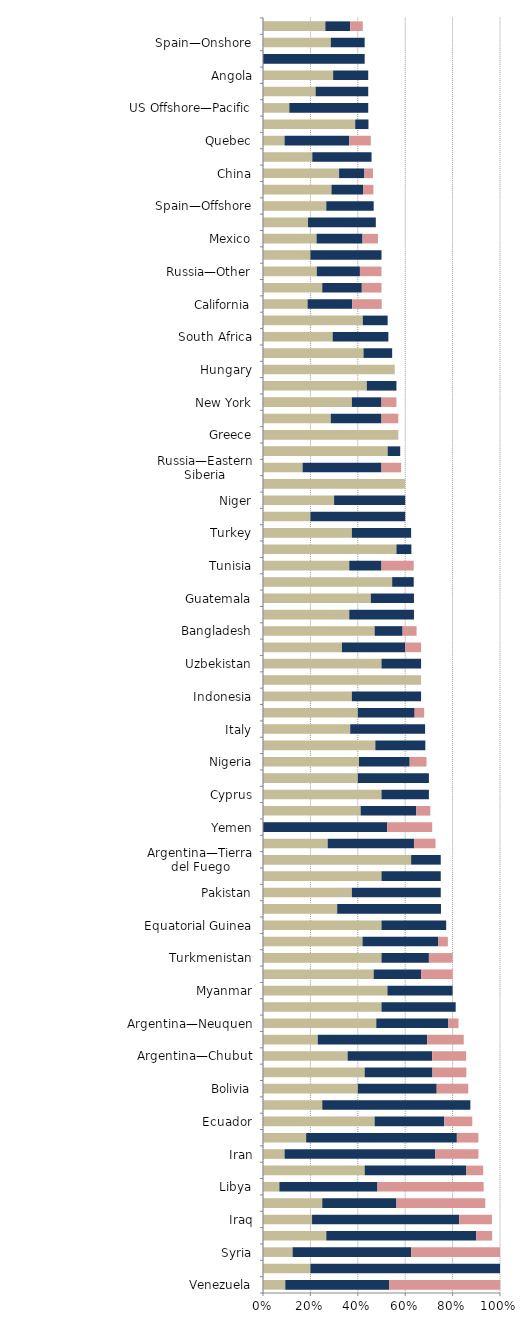
| Category |   Mild deterrent to investment |   Strong deterrent to investment |   Would not pursue investment due to this factor |
|---|---|---|---|
| Venezuela | 0.094 | 0.438 | 0.469 |
| Kyrgyzstan | 0.2 | 0.8 | 0 |
| Syria | 0.125 | 0.5 | 0.375 |
| Egypt | 0.267 | 0.633 | 0.067 |
| Iraq | 0.207 | 0.621 | 0.138 |
| South Sudan | 0.25 | 0.313 | 0.375 |
| Libya | 0.069 | 0.414 | 0.448 |
| Democratic Republic of the Congo (Kinshasa) | 0.429 | 0.429 | 0.071 |
| Iran | 0.091 | 0.636 | 0.182 |
| Lebanon | 0.182 | 0.636 | 0.091 |
| Ecuador | 0.471 | 0.294 | 0.118 |
| Mali | 0.25 | 0.625 | 0 |
| Bolivia | 0.4 | 0.333 | 0.133 |
| Somaliland | 0.429 | 0.286 | 0.143 |
| Argentina—Chubut | 0.357 | 0.357 | 0.143 |
| Ukraine | 0.231 | 0.462 | 0.154 |
| Argentina—Neuquen | 0.478 | 0.304 | 0.043 |
| Argentina—Mendoza | 0.5 | 0.313 | 0 |
| Myanmar | 0.525 | 0.275 | 0 |
| Argentina—Santa Cruz | 0.467 | 0.2 | 0.133 |
| Turkmenistan | 0.5 | 0.2 | 0.1 |
| Thailand | 0.42 | 0.32 | 0.04 |
| Equatorial Guinea | 0.5 | 0.273 | 0 |
| Madagascar | 0.313 | 0.438 | 0 |
| Pakistan | 0.375 | 0.375 | 0 |
| Argentina—Salta | 0.5 | 0.25 | 0 |
| Argentina—Tierra del Fuego | 0.625 | 0.125 | 0 |
| Russia—Offshore Arctic | 0.273 | 0.364 | 0.091 |
| Yemen | 0 | 0.524 | 0.19 |
| Cambodia | 0.412 | 0.235 | 0.059 |
| Cyprus | 0.5 | 0.2 | 0 |
| Algeria | 0.4 | 0.3 | 0 |
| Nigeria | 0.405 | 0.214 | 0.071 |
| Tanzania | 0.474 | 0.211 | 0 |
| Italy | 0.368 | 0.316 | 0 |
| Papua New Guinea | 0.4 | 0.24 | 0.04 |
| Indonesia | 0.375 | 0.292 | 0 |
| Georgia | 0.667 | 0 | 0 |
| Uzbekistan | 0.5 | 0.167 | 0 |
| Chad | 0.333 | 0.267 | 0.067 |
| Bangladesh | 0.471 | 0.118 | 0.059 |
| Albania | 0.364 | 0.273 | 0 |
| Guatemala | 0.455 | 0.182 | 0 |
| Mauritania | 0.545 | 0.091 | 0 |
| Tunisia | 0.364 | 0.136 | 0.136 |
| Uganda | 0.563 | 0.063 | 0 |
| Turkey | 0.375 | 0.25 | 0 |
| Republic of the Congo (Brazzaville) | 0.2 | 0.4 | 0 |
| Niger | 0.3 | 0.3 | 0 |
| Jordan | 0.6 | 0 | 0 |
| Russia—Eastern Siberia | 0.167 | 0.333 | 0.083 |
| Kenya | 0.526 | 0.053 | 0 |
| Greece | 0.571 | 0 | 0 |
| Azerbaijan | 0.286 | 0.214 | 0.071 |
| New York | 0.375 | 0.125 | 0.063 |
| Cameroon | 0.438 | 0.125 | 0 |
| Hungary | 0.556 | 0 | 0 |
| Gabon | 0.424 | 0.121 | 0 |
| South Africa | 0.294 | 0.235 | 0 |
| Ivory Coast | 0.421 | 0.105 | 0 |
| California | 0.188 | 0.188 | 0.125 |
| Bulgaria | 0.25 | 0.167 | 0.083 |
| Russia—Other | 0.227 | 0.182 | 0.091 |
| Bahrain | 0.2 | 0.3 | 0 |
| Mexico | 0.226 | 0.194 | 0.065 |
| France | 0.19 | 0.286 | 0 |
| Spain—Offshore | 0.267 | 0.2 | 0 |
| Colorado | 0.289 | 0.133 | 0.044 |
| China | 0.321 | 0.107 | 0.036 |
| Kazakhstan | 0.208 | 0.25 | 0 |
| Quebec | 0.091 | 0.273 | 0.091 |
| Brazil—Onshore CC | 0.389 | 0.056 | 0 |
| US Offshore—Pacific | 0.111 | 0.333 | 0 |
| Russia—Offshore Sakhalin | 0.222 | 0.222 | 0 |
| Angola | 0.296 | 0.148 | 0 |
| Ethiopia | 0 | 0.429 | 0 |
| Spain—Onshore | 0.286 | 0.143 | 0 |
| Timor Gap (JPDA) | 0.263 | 0.105 | 0.053 |